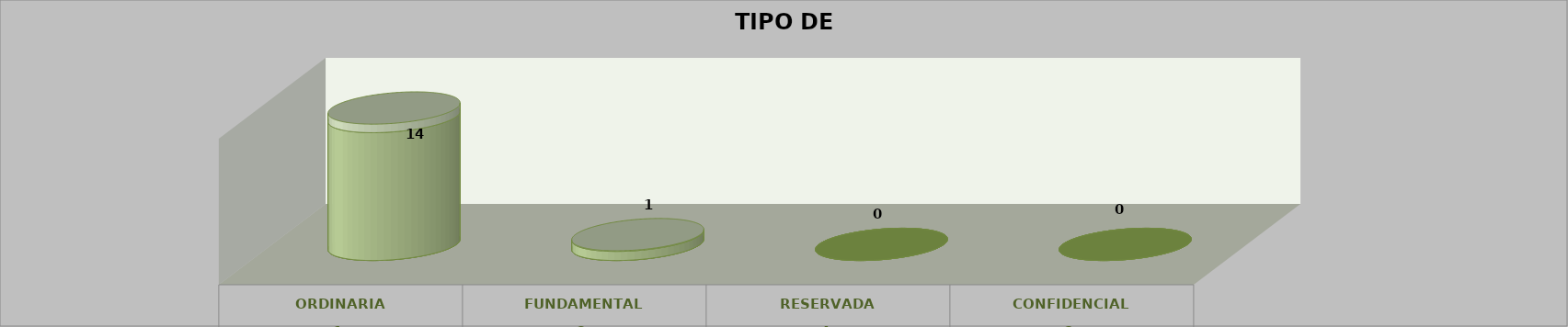
| Category | Series 0 | Series 2 | Series 1 | Series 3 | Series 4 |
|---|---|---|---|---|---|
| 0 |  |  |  | 14 | 0.933 |
| 1 |  |  |  | 1 | 0.067 |
| 2 |  |  |  | 0 | 0 |
| 3 |  |  |  | 0 | 0 |